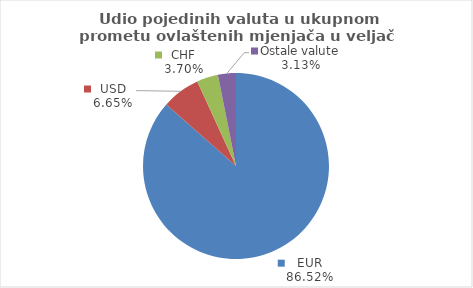
| Category | Series 0 |
|---|---|
| EUR | 86.522 |
| USD | 6.646 |
| CHF | 3.702 |
| Ostale valute | 3.13 |